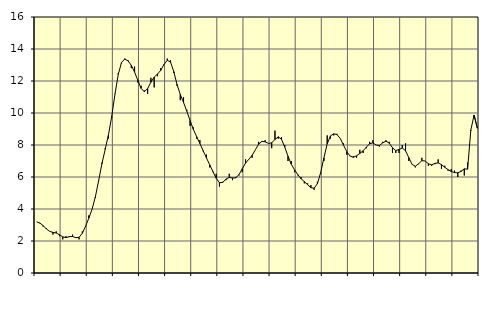
| Category | Piggar | Series 1 |
|---|---|---|
| nan | 3.2 | 3.2 |
| 87.0 | 3.1 | 3.12 |
| 87.0 | 2.9 | 2.96 |
| 87.0 | 2.8 | 2.75 |
| nan | 2.6 | 2.6 |
| 88.0 | 2.4 | 2.54 |
| 88.0 | 2.6 | 2.5 |
| 88.0 | 2.3 | 2.39 |
| nan | 2.1 | 2.26 |
| 89.0 | 2.3 | 2.21 |
| 89.0 | 2.3 | 2.27 |
| 89.0 | 2.4 | 2.28 |
| nan | 2.2 | 2.21 |
| 90.0 | 2.1 | 2.23 |
| 90.0 | 2.6 | 2.48 |
| 90.0 | 2.9 | 2.93 |
| nan | 3.6 | 3.43 |
| 91.0 | 4 | 4 |
| 91.0 | 4.7 | 4.77 |
| 91.0 | 5.8 | 5.78 |
| nan | 6.9 | 6.83 |
| 92.0 | 7.8 | 7.73 |
| 92.0 | 8.4 | 8.64 |
| 92.0 | 9.7 | 9.79 |
| nan | 11.2 | 11.18 |
| 93.0 | 12.5 | 12.41 |
| 93.0 | 13.1 | 13.16 |
| 93.0 | 13.4 | 13.37 |
| nan | 13.3 | 13.26 |
| 94.0 | 12.8 | 12.98 |
| 94.0 | 12.9 | 12.56 |
| 94.0 | 11.9 | 12.04 |
| nan | 11.7 | 11.54 |
| 95.0 | 11.4 | 11.33 |
| 95.0 | 11.2 | 11.53 |
| 95.0 | 12.2 | 11.92 |
| nan | 11.6 | 12.24 |
| 96.0 | 12.3 | 12.43 |
| 96.0 | 12.8 | 12.66 |
| 96.0 | 13 | 13.03 |
| nan | 13.4 | 13.29 |
| 97.0 | 13.3 | 13.19 |
| 97.0 | 12.5 | 12.59 |
| 97.0 | 11.7 | 11.79 |
| nan | 10.8 | 11.16 |
| 98.0 | 11 | 10.66 |
| 98.0 | 10.2 | 10.11 |
| 98.0 | 9.2 | 9.53 |
| nan | 9.1 | 8.98 |
| 99.0 | 8.4 | 8.53 |
| 99.0 | 8.3 | 8.09 |
| 99.0 | 7.6 | 7.65 |
| nan | 7.4 | 7.2 |
| 0.0 | 6.6 | 6.77 |
| 0.0 | 6.3 | 6.34 |
| 0.0 | 6.2 | 5.92 |
| nan | 5.4 | 5.64 |
| 1.0 | 5.7 | 5.66 |
| 1.0 | 5.8 | 5.87 |
| 1.0 | 6.2 | 5.97 |
| nan | 5.8 | 5.94 |
| 2.0 | 6 | 5.95 |
| 2.0 | 6.1 | 6.15 |
| 2.0 | 6.3 | 6.52 |
| nan | 7.1 | 6.87 |
| 3.0 | 7.1 | 7.11 |
| 3.0 | 7.2 | 7.35 |
| 3.0 | 7.7 | 7.7 |
| nan | 8.2 | 8.05 |
| 4.0 | 8.2 | 8.23 |
| 4.0 | 8.3 | 8.2 |
| 4.0 | 8.1 | 8.1 |
| nan | 7.8 | 8.14 |
| 5.0 | 8.9 | 8.34 |
| 5.0 | 8.4 | 8.51 |
| 5.0 | 8.5 | 8.36 |
| nan | 8 | 7.87 |
| 6.0 | 7 | 7.3 |
| 6.0 | 7 | 6.8 |
| 6.0 | 6.3 | 6.45 |
| nan | 6.1 | 6.15 |
| 7.0 | 6 | 5.89 |
| 7.0 | 5.6 | 5.71 |
| 7.0 | 5.6 | 5.52 |
| nan | 5.5 | 5.33 |
| 8.0 | 5.2 | 5.3 |
| 8.0 | 5.7 | 5.58 |
| 8.0 | 6.2 | 6.27 |
| nan | 7 | 7.2 |
| 9.0 | 8.6 | 8.07 |
| 9.0 | 8.4 | 8.57 |
| 9.0 | 8.6 | 8.7 |
| nan | 8.7 | 8.65 |
| 10.0 | 8.4 | 8.41 |
| 10.0 | 8.1 | 7.99 |
| 10.0 | 7.4 | 7.59 |
| nan | 7.3 | 7.31 |
| 11.0 | 7.3 | 7.23 |
| 11.0 | 7.2 | 7.33 |
| 11.0 | 7.7 | 7.47 |
| nan | 7.5 | 7.64 |
| 12.0 | 7.8 | 7.87 |
| 12.0 | 8.2 | 8.08 |
| 12.0 | 8.3 | 8.13 |
| nan | 8 | 8 |
| 13.0 | 7.9 | 7.97 |
| 13.0 | 8.2 | 8.13 |
| 13.0 | 8.3 | 8.24 |
| nan | 8.2 | 8.12 |
| 14.0 | 7.5 | 7.83 |
| 14.0 | 7.5 | 7.65 |
| 14.0 | 7.5 | 7.72 |
| nan | 8 | 7.81 |
| 15.0 | 8.1 | 7.64 |
| 15.0 | 7 | 7.21 |
| 15.0 | 6.8 | 6.79 |
| nan | 6.6 | 6.67 |
| 16.0 | 6.8 | 6.83 |
| 16.0 | 7.2 | 7.02 |
| 16.0 | 7 | 7 |
| nan | 6.7 | 6.83 |
| 17.0 | 6.7 | 6.76 |
| 17.0 | 6.8 | 6.85 |
| 17.0 | 7.1 | 6.88 |
| nan | 6.5 | 6.77 |
| 18.0 | 6.7 | 6.61 |
| 18.0 | 6.4 | 6.46 |
| 18.0 | 6.5 | 6.34 |
| nan | 6.4 | 6.28 |
| 19.0 | 6 | 6.26 |
| 19.0 | 6.4 | 6.35 |
| 19.0 | 6.1 | 6.51 |
| nan | 6.9 | 6.49 |
| 20.0 | 8.9 | 8.94 |
| 20.0 | 9.7 | 9.87 |
| 20.0 | 9.1 | 9.05 |